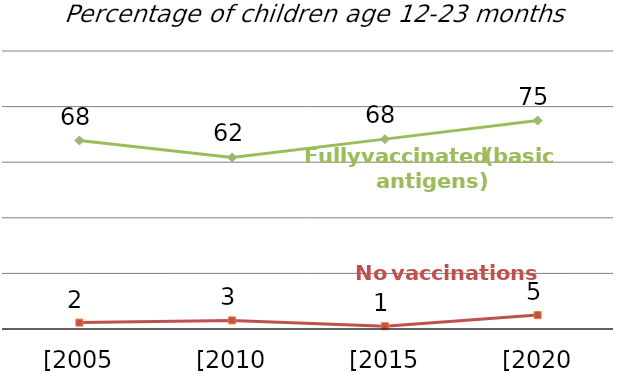
| Category | Fully vaccinated (basic antigens) | No vaccinations |
|---|---|---|
| [2005 xDHS] | 67.8 | 2.3 |
| [2010 xDHS] | 61.7 | 3.1 |
| [2015 xDHS] | 68.3 | 1 |
| [2020 xDHS] | 75 | 5 |